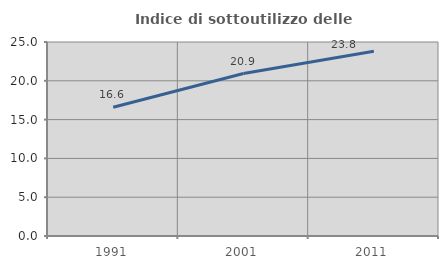
| Category | Indice di sottoutilizzo delle abitazioni  |
|---|---|
| 1991.0 | 16.592 |
| 2001.0 | 20.932 |
| 2011.0 | 23.807 |